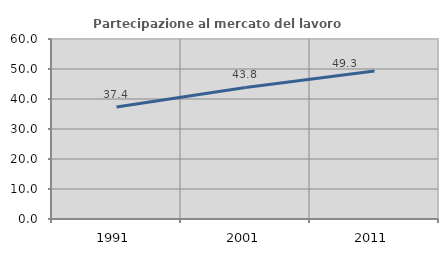
| Category | Partecipazione al mercato del lavoro  femminile |
|---|---|
| 1991.0 | 37.352 |
| 2001.0 | 43.839 |
| 2011.0 | 49.341 |